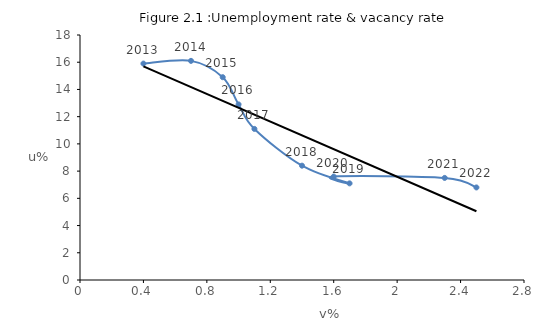
| Category | Unemployment rate |
|---|---|
| 0.4 | 15.9 |
| 0.7 | 16.1 |
| 0.9 | 14.9 |
| 1.0 | 12.9 |
| 1.1 | 11.1 |
| 1.4 | 8.4 |
| 1.7 | 7.1 |
| 1.6 | 7.6 |
| 2.3 | 7.5 |
| 2.5 | 6.8 |